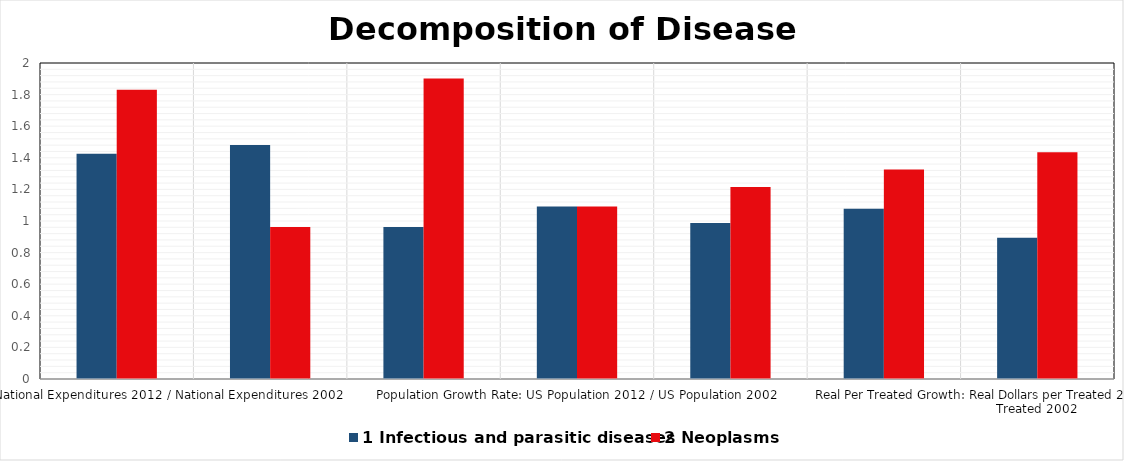
| Category | 1 Infectious and parasitic diseases | 2 Neoplasms |
|---|---|---|
| Nominal Growth: National Expenditures 2012 / National Expenditures 2002 | 1.425 | 1.831 |
| Price Index Growth: Yearly Cumulative Price Index 2012 / Yearly Cumulative Price Index 2002 | 1.481 | 0.963 |
| Real Growth in 2002 dollars: Nominal Growth / Price Index Growth | 0.962 | 1.902 |
| Population Growth Rate: US Population 2012 / US Population 2002 | 1.091 | 1.091 |
| Prevalence Growth: % of Population with Disease: % of Population with Disease 2012/ % of Population with Disease in 2002 | 0.987 | 1.215 |
| Growth in Population Treated for Disease | 1.077 | 1.326 |
| Real Per Treated Growth: Real Dollars per Treated 2012 / Real Dollars per Treated 2002 | 0.893 | 1.435 |